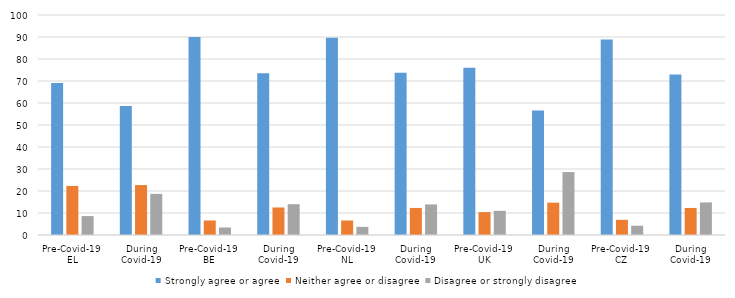
| Category | Strongly agree or agree | Neither agree or disagree | Disagree or strongly disagree |
|---|---|---|---|
| 0 | 69.1 | 22.3 | 8.6 |
| 1 | 58.6 | 22.7 | 18.7 |
| 2 | 90 | 6.6 | 3.4 |
| 3 | 73.5 | 12.5 | 14 |
| 4 | 89.7 | 6.6 | 3.7 |
| 5 | 73.7 | 12.3 | 13.9 |
| 6 | 76 | 10.4 | 11 |
| 7 | 56.6 | 14.7 | 28.6 |
| 8 | 88.9 | 6.9 | 4.2 |
| 9 | 72.9 | 12.3 | 14.8 |